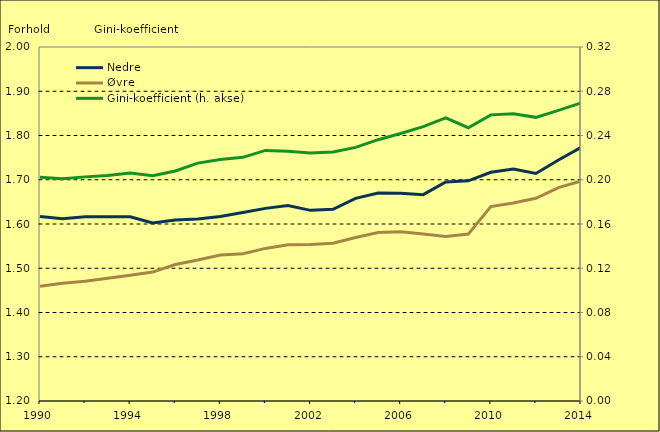
| Category | Nedre | Øvre |
|---|---|---|
| 1990.0 | 1.617 | 1.459 |
| 1991.0 | 1.612 | 1.466 |
| 1992.0 | 1.617 | 1.471 |
| 1993.0 | 1.616 | 1.477 |
| 1994.0 | 1.616 | 1.484 |
| 1995.0 | 1.602 | 1.491 |
| 1996.0 | 1.609 | 1.509 |
| 1997.0 | 1.611 | 1.519 |
| 1998.0 | 1.617 | 1.53 |
| 1999.0 | 1.626 | 1.533 |
| 2000.0 | 1.635 | 1.545 |
| 2001.0 | 1.642 | 1.553 |
| 2002.0 | 1.631 | 1.554 |
| 2003.0 | 1.633 | 1.556 |
| 2004.0 | 1.658 | 1.57 |
| 2005.0 | 1.67 | 1.581 |
| 2006.0 | 1.67 | 1.583 |
| 2007.0 | 1.666 | 1.577 |
| 2008.0 | 1.695 | 1.572 |
| 2009.0 | 1.698 | 1.577 |
| 2010.0 | 1.717 | 1.639 |
| 2011.0 | 1.724 | 1.647 |
| 2012.0 | 1.714 | 1.658 |
| 2013.0 | 1.745 | 1.682 |
| 2014.0 | 1.773 | 1.697 |